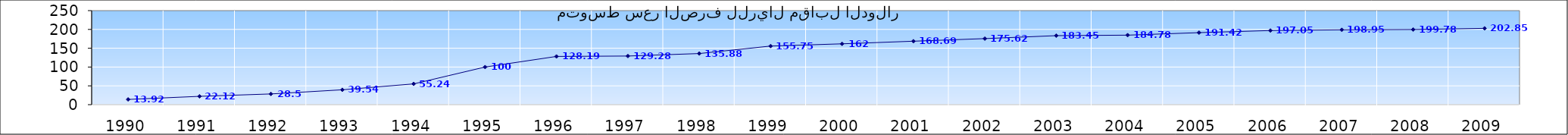
| Category | متوسط سعر الصرف للريال مقابل الدولار |
|---|---|
| 1990.0 | 13.92 |
| 1991.0 | 22.12 |
| 1992.0 | 28.5 |
| 1993.0 | 39.54 |
| 1994.0 | 55.24 |
| 1995.0 | 100 |
| 1996.0 | 128.19 |
| 1997.0 | 129.28 |
| 1998.0 | 135.88 |
| 1999.0 | 155.75 |
| 2000.0 | 161.73 |
| 2001.0 | 168.69 |
| 2002.0 | 175.62 |
| 2003.0 | 183.45 |
| 2004.0 | 184.78 |
| 2005.0 | 191.42 |
| 2006.0 | 197.05 |
| 2007.0 | 198.95 |
| 2008.0 | 199.78 |
| 2009.0 | 202.85 |